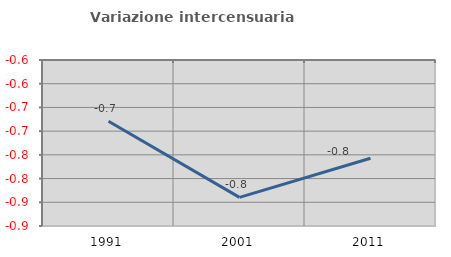
| Category | Variazione intercensuaria annua |
|---|---|
| 1991.0 | -0.679 |
| 2001.0 | -0.84 |
| 2011.0 | -0.757 |